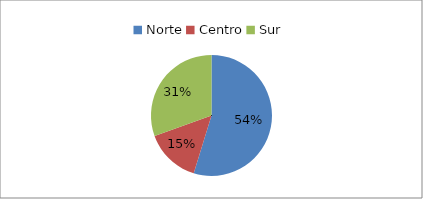
| Category | Series 0 | Series 1 |
|---|---|---|
| Norte | 219 |  |
| Centro | 59 |  |
| Sur | 122 |  |